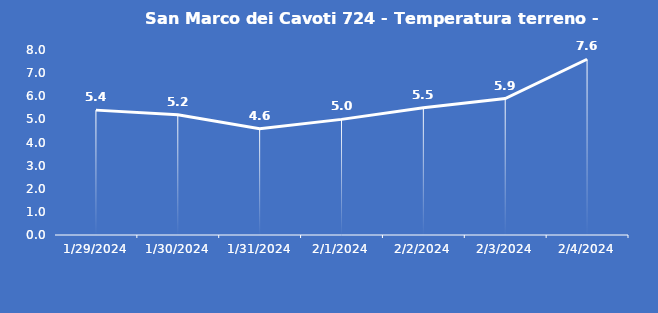
| Category | San Marco dei Cavoti 724 - Temperatura terreno - Grezzo (°C) |
|---|---|
| 1/29/24 | 5.4 |
| 1/30/24 | 5.2 |
| 1/31/24 | 4.6 |
| 2/1/24 | 5 |
| 2/2/24 | 5.5 |
| 2/3/24 | 5.9 |
| 2/4/24 | 7.6 |